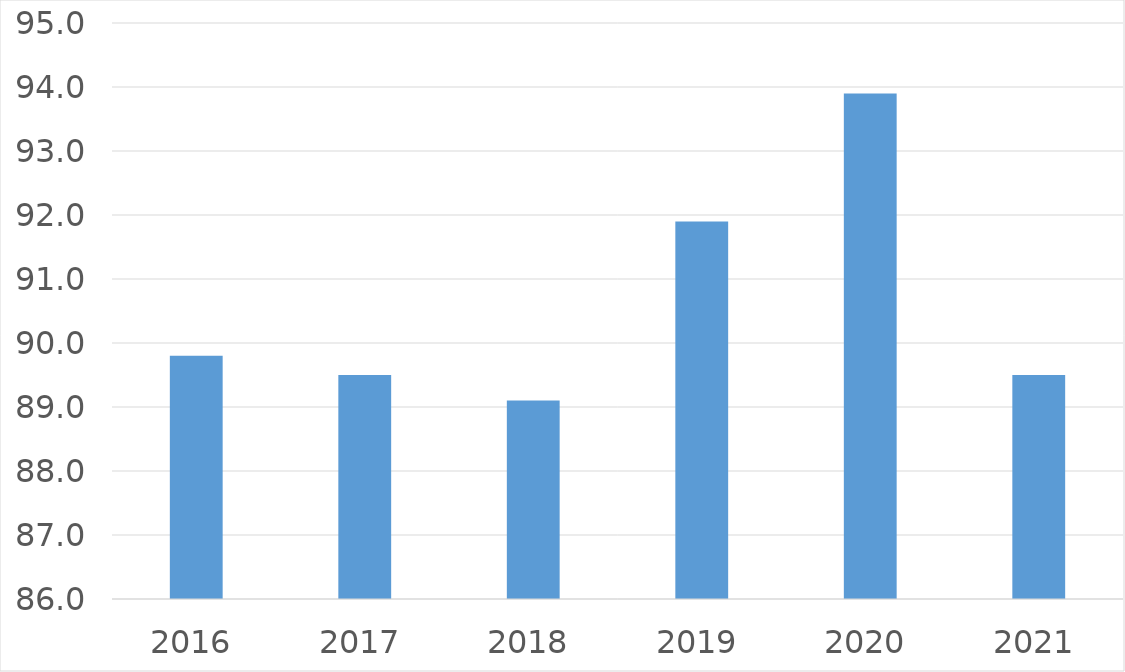
| Category | Series 0 |
|---|---|
| 2016 | 89.8 |
| 2017 | 89.5 |
| 2018 | 89.1 |
| 2019 | 91.9 |
| 2020 | 93.9 |
| 2021 | 89.5 |